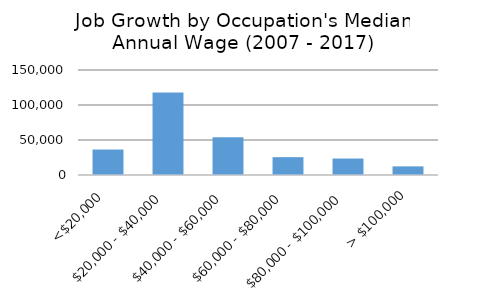
| Category | Series 0 |
|---|---|
|  <$20,000  | 36381 |
| $20,000 - $40,000 | 117903 |
| $40,000 - $60,000 | 53891 |
| $60,000 - $80,000 | 25488 |
| $80,000 - $100,000 | 23517 |
| > $100,000 | 12321 |